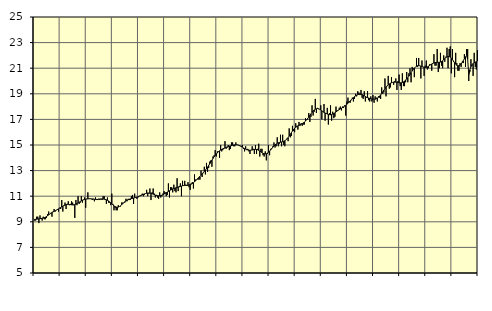
| Category | Finansiell verksamhet, företagstjänster, SNI 64-82 | Series 3 |
|---|---|---|
| nan | 9.1 | 9.19 |
| 87.0 | 9.1 | 9.19 |
| 87.0 | 9.4 | 9.2 |
| 87.0 | 9.4 | 9.22 |
| 87.0 | 8.9 | 9.23 |
| 87.0 | 9.5 | 9.24 |
| 87.0 | 9.3 | 9.26 |
| 87.0 | 9.1 | 9.27 |
| 87.0 | 9.4 | 9.29 |
| 87.0 | 9.2 | 9.32 |
| 87.0 | 9.2 | 9.36 |
| 87.0 | 9.3 | 9.42 |
| nan | 9.6 | 9.48 |
| 88.0 | 9.8 | 9.54 |
| 88.0 | 9.6 | 9.6 |
| 88.0 | 9.7 | 9.66 |
| 88.0 | 9.4 | 9.72 |
| 88.0 | 9.8 | 9.77 |
| 88.0 | 10 | 9.82 |
| 88.0 | 9.8 | 9.86 |
| 88.0 | 9.9 | 9.91 |
| 88.0 | 10 | 9.96 |
| 88.0 | 9.8 | 10.01 |
| 88.0 | 10.1 | 10.06 |
| nan | 10 | 10.11 |
| 89.0 | 10.7 | 10.16 |
| 89.0 | 9.8 | 10.21 |
| 89.0 | 10.3 | 10.26 |
| 89.0 | 10.5 | 10.31 |
| 89.0 | 10 | 10.34 |
| 89.0 | 10.4 | 10.36 |
| 89.0 | 10.6 | 10.36 |
| 89.0 | 10.3 | 10.35 |
| 89.0 | 10.4 | 10.34 |
| 89.0 | 10.6 | 10.33 |
| 89.0 | 10.5 | 10.32 |
| nan | 10.3 | 10.33 |
| 90.0 | 9.3 | 10.35 |
| 90.0 | 10.7 | 10.38 |
| 90.0 | 10.3 | 10.42 |
| 90.0 | 11 | 10.47 |
| 90.0 | 10.4 | 10.52 |
| 90.0 | 10.5 | 10.58 |
| 90.0 | 11 | 10.63 |
| 90.0 | 10.5 | 10.68 |
| 90.0 | 10.7 | 10.72 |
| 90.0 | 10.9 | 10.74 |
| 90.0 | 10.1 | 10.76 |
| nan | 10.8 | 10.78 |
| 91.0 | 11.3 | 10.79 |
| 91.0 | 10.8 | 10.8 |
| 91.0 | 10.8 | 10.8 |
| 91.0 | 10.8 | 10.8 |
| 91.0 | 10.7 | 10.79 |
| 91.0 | 10.8 | 10.77 |
| 91.0 | 10.6 | 10.76 |
| 91.0 | 10.9 | 10.75 |
| 91.0 | 10.7 | 10.75 |
| 91.0 | 10.7 | 10.75 |
| 91.0 | 10.8 | 10.76 |
| nan | 10.7 | 10.78 |
| 92.0 | 10.8 | 10.78 |
| 92.0 | 10.7 | 10.78 |
| 92.0 | 11 | 10.78 |
| 92.0 | 11 | 10.77 |
| 92.0 | 10.7 | 10.75 |
| 92.0 | 10.4 | 10.72 |
| 92.0 | 10.9 | 10.68 |
| 92.0 | 10.5 | 10.63 |
| 92.0 | 10.5 | 10.56 |
| 92.0 | 10.3 | 10.48 |
| 92.0 | 11.2 | 10.4 |
| nan | 10.4 | 10.32 |
| 93.0 | 9.9 | 10.24 |
| 93.0 | 10.1 | 10.19 |
| 93.0 | 9.9 | 10.15 |
| 93.0 | 9.9 | 10.14 |
| 93.0 | 10.3 | 10.15 |
| 93.0 | 10.2 | 10.19 |
| 93.0 | 10.2 | 10.25 |
| 93.0 | 10.5 | 10.33 |
| 93.0 | 10.5 | 10.41 |
| 93.0 | 10.5 | 10.49 |
| 93.0 | 10.5 | 10.57 |
| nan | 10.8 | 10.63 |
| 94.0 | 10.6 | 10.68 |
| 94.0 | 10.8 | 10.72 |
| 94.0 | 10.7 | 10.76 |
| 94.0 | 10.7 | 10.79 |
| 94.0 | 11 | 10.81 |
| 94.0 | 11.1 | 10.83 |
| 94.0 | 10.4 | 10.86 |
| 94.0 | 11.2 | 10.88 |
| 94.0 | 10.9 | 10.9 |
| 94.0 | 10.8 | 10.93 |
| 94.0 | 10.9 | 10.95 |
| nan | 11 | 10.99 |
| 95.0 | 11 | 11.03 |
| 95.0 | 11.1 | 11.07 |
| 95.0 | 11.2 | 11.11 |
| 95.0 | 11 | 11.15 |
| 95.0 | 11.1 | 11.18 |
| 95.0 | 11.2 | 11.21 |
| 95.0 | 11.5 | 11.23 |
| 95.0 | 11 | 11.25 |
| 95.0 | 11.2 | 11.25 |
| 95.0 | 11.6 | 11.24 |
| 95.0 | 10.7 | 11.23 |
| nan | 11.3 | 11.2 |
| 96.0 | 11.6 | 11.16 |
| 96.0 | 11.2 | 11.12 |
| 96.0 | 10.9 | 11.09 |
| 96.0 | 11.1 | 11.06 |
| 96.0 | 10.9 | 11.04 |
| 96.0 | 10.8 | 11.03 |
| 96.0 | 11.3 | 11.04 |
| 96.0 | 10.9 | 11.05 |
| 96.0 | 11 | 11.08 |
| 96.0 | 11.2 | 11.12 |
| 96.0 | 11.4 | 11.17 |
| nan | 11.3 | 11.22 |
| 97.0 | 11 | 11.27 |
| 97.0 | 11.1 | 11.32 |
| 97.0 | 12 | 11.37 |
| 97.0 | 10.9 | 11.42 |
| 97.0 | 11.7 | 11.48 |
| 97.0 | 11.7 | 11.52 |
| 97.0 | 11.3 | 11.57 |
| 97.0 | 11.9 | 11.6 |
| 97.0 | 11.4 | 11.63 |
| 97.0 | 11.3 | 11.66 |
| 97.0 | 12.4 | 11.68 |
| nan | 11.4 | 11.71 |
| 98.0 | 11.8 | 11.73 |
| 98.0 | 12 | 11.76 |
| 98.0 | 11 | 11.79 |
| 98.0 | 12.2 | 11.82 |
| 98.0 | 11.8 | 11.83 |
| 98.0 | 12.2 | 11.84 |
| 98.0 | 11.9 | 11.84 |
| 98.0 | 11.8 | 11.85 |
| 98.0 | 12.1 | 11.86 |
| 98.0 | 11.7 | 11.88 |
| 98.0 | 11.5 | 11.91 |
| nan | 12 | 11.94 |
| 99.0 | 12.1 | 11.99 |
| 99.0 | 11.6 | 12.05 |
| 99.0 | 12.7 | 12.12 |
| 99.0 | 12.3 | 12.21 |
| 99.0 | 12.3 | 12.29 |
| 99.0 | 12.3 | 12.38 |
| 99.0 | 12.3 | 12.47 |
| 99.0 | 12.3 | 12.55 |
| 99.0 | 13 | 12.64 |
| 99.0 | 12.5 | 12.73 |
| 99.0 | 12.8 | 12.83 |
| nan | 13.3 | 12.93 |
| 0.0 | 12.7 | 13.04 |
| 0.0 | 13.6 | 13.15 |
| 0.0 | 12.9 | 13.27 |
| 0.0 | 13.2 | 13.4 |
| 0.0 | 13.7 | 13.53 |
| 0.0 | 13.8 | 13.67 |
| 0.0 | 13.3 | 13.81 |
| 0.0 | 14.1 | 13.95 |
| 0.0 | 14.2 | 14.08 |
| 0.0 | 14.6 | 14.19 |
| 0.0 | 14.1 | 14.3 |
| nan | 14.5 | 14.39 |
| 1.0 | 14.5 | 14.47 |
| 1.0 | 14 | 14.54 |
| 1.0 | 15 | 14.6 |
| 1.0 | 14.5 | 14.65 |
| 1.0 | 14.6 | 14.7 |
| 1.0 | 14.7 | 14.74 |
| 1.0 | 15.3 | 14.78 |
| 1.0 | 14.7 | 14.82 |
| 1.0 | 14.8 | 14.85 |
| 1.0 | 15 | 14.88 |
| 1.0 | 14.6 | 14.91 |
| nan | 14.7 | 14.93 |
| 2.0 | 15.2 | 14.95 |
| 2.0 | 15.2 | 14.98 |
| 2.0 | 14.9 | 15 |
| 2.0 | 14.9 | 15.01 |
| 2.0 | 15.2 | 15.02 |
| 2.0 | 15 | 15.02 |
| 2.0 | 15 | 15 |
| 2.0 | 15 | 14.97 |
| 2.0 | 14.9 | 14.93 |
| 2.0 | 14.9 | 14.88 |
| 2.0 | 15 | 14.83 |
| nan | 14.7 | 14.77 |
| 3.0 | 14.5 | 14.72 |
| 3.0 | 14.9 | 14.68 |
| 3.0 | 14.6 | 14.64 |
| 3.0 | 14.7 | 14.61 |
| 3.0 | 14.5 | 14.59 |
| 3.0 | 14.3 | 14.59 |
| 3.0 | 14.6 | 14.6 |
| 3.0 | 14.9 | 14.61 |
| 3.0 | 14.7 | 14.63 |
| 3.0 | 14.3 | 14.65 |
| 3.0 | 15 | 14.66 |
| nan | 14.3 | 14.65 |
| 4.0 | 14.7 | 14.63 |
| 4.0 | 15.1 | 14.58 |
| 4.0 | 14.1 | 14.53 |
| 4.0 | 14.7 | 14.47 |
| 4.0 | 14.7 | 14.41 |
| 4.0 | 14.2 | 14.35 |
| 4.0 | 14.1 | 14.32 |
| 4.0 | 14.5 | 14.31 |
| 4.0 | 13.8 | 14.32 |
| 4.0 | 14.3 | 14.37 |
| 4.0 | 15 | 14.43 |
| nan | 14.2 | 14.52 |
| 5.0 | 14.7 | 14.62 |
| 5.0 | 14.7 | 14.73 |
| 5.0 | 14.9 | 14.83 |
| 5.0 | 15.2 | 14.93 |
| 5.0 | 14.8 | 15.01 |
| 5.0 | 14.9 | 15.08 |
| 5.0 | 15.6 | 15.14 |
| 5.0 | 14.9 | 15.17 |
| 5.0 | 15.1 | 15.2 |
| 5.0 | 15.8 | 15.22 |
| 5.0 | 14.9 | 15.24 |
| nan | 15.8 | 15.26 |
| 6.0 | 15 | 15.29 |
| 6.0 | 14.9 | 15.33 |
| 6.0 | 15.4 | 15.4 |
| 6.0 | 15.5 | 15.48 |
| 6.0 | 15.3 | 15.58 |
| 6.0 | 16.3 | 15.7 |
| 6.0 | 15.6 | 15.83 |
| 6.0 | 15.7 | 15.96 |
| 6.0 | 16.5 | 16.09 |
| 6.0 | 16.1 | 16.21 |
| 6.0 | 16 | 16.31 |
| nan | 16.7 | 16.38 |
| 7.0 | 16.5 | 16.44 |
| 7.0 | 16.2 | 16.49 |
| 7.0 | 16.8 | 16.54 |
| 7.0 | 16.5 | 16.58 |
| 7.0 | 16.7 | 16.62 |
| 7.0 | 16.5 | 16.67 |
| 7.0 | 16.6 | 16.73 |
| 7.0 | 16.6 | 16.79 |
| 7.0 | 17.1 | 16.87 |
| 7.0 | 17 | 16.97 |
| 7.0 | 17 | 17.07 |
| nan | 17.5 | 17.19 |
| 8.0 | 16.8 | 17.31 |
| 8.0 | 17.2 | 17.43 |
| 8.0 | 18.1 | 17.55 |
| 8.0 | 17.3 | 17.65 |
| 8.0 | 17.6 | 17.74 |
| 8.0 | 18.6 | 17.8 |
| 8.0 | 17.5 | 17.83 |
| 8.0 | 17.9 | 17.85 |
| 8.0 | 17.8 | 17.83 |
| 8.0 | 17.8 | 17.79 |
| 8.0 | 18.1 | 17.74 |
| nan | 17 | 17.67 |
| 9.0 | 17.6 | 17.61 |
| 9.0 | 18.2 | 17.55 |
| 9.0 | 16.9 | 17.5 |
| 9.0 | 17.5 | 17.46 |
| 9.0 | 17.9 | 17.42 |
| 9.0 | 16.6 | 17.39 |
| 9.0 | 17.5 | 17.37 |
| 9.0 | 18.1 | 17.36 |
| 9.0 | 16.9 | 17.38 |
| 9.0 | 17.6 | 17.41 |
| 9.0 | 17.1 | 17.45 |
| nan | 17.2 | 17.51 |
| 10.0 | 18 | 17.58 |
| 10.0 | 17.7 | 17.65 |
| 10.0 | 17.7 | 17.71 |
| 10.0 | 17.9 | 17.76 |
| 10.0 | 18 | 17.82 |
| 10.0 | 17.7 | 17.87 |
| 10.0 | 18 | 17.92 |
| 10.0 | 17.9 | 17.98 |
| 10.0 | 18.1 | 18.04 |
| 10.0 | 17.3 | 18.11 |
| 10.0 | 18.4 | 18.18 |
| nan | 18.7 | 18.26 |
| 11.0 | 18.4 | 18.35 |
| 11.0 | 18.3 | 18.44 |
| 11.0 | 18.5 | 18.53 |
| 11.0 | 18.7 | 18.61 |
| 11.0 | 18.4 | 18.7 |
| 11.0 | 18.6 | 18.78 |
| 11.0 | 19 | 18.84 |
| 11.0 | 18.8 | 18.9 |
| 11.0 | 19.2 | 18.94 |
| 11.0 | 19.1 | 18.97 |
| 11.0 | 18.9 | 18.98 |
| nan | 19.3 | 18.97 |
| 12.0 | 18.7 | 18.94 |
| 12.0 | 18.6 | 18.89 |
| 12.0 | 19.2 | 18.84 |
| 12.0 | 18.4 | 18.79 |
| 12.0 | 18.7 | 18.74 |
| 12.0 | 19.2 | 18.7 |
| 12.0 | 18.5 | 18.67 |
| 12.0 | 18.4 | 18.64 |
| 12.0 | 18.8 | 18.62 |
| 12.0 | 18.4 | 18.6 |
| 12.0 | 18.9 | 18.58 |
| nan | 18.3 | 18.57 |
| 13.0 | 18.8 | 18.58 |
| 13.0 | 18.7 | 18.61 |
| 13.0 | 18.4 | 18.66 |
| 13.0 | 18.8 | 18.72 |
| 13.0 | 18.7 | 18.81 |
| 13.0 | 18.6 | 18.91 |
| 13.0 | 19.5 | 19.03 |
| 13.0 | 19 | 19.15 |
| 13.0 | 19.1 | 19.28 |
| 13.0 | 20.2 | 19.4 |
| 13.0 | 18.8 | 19.52 |
| nan | 19.6 | 19.62 |
| 14.0 | 20.4 | 19.7 |
| 14.0 | 19.4 | 19.77 |
| 14.0 | 19.5 | 19.82 |
| 14.0 | 20.3 | 19.86 |
| 14.0 | 19.9 | 19.89 |
| 14.0 | 19.7 | 19.91 |
| 14.0 | 20 | 19.91 |
| 14.0 | 20.2 | 19.91 |
| 14.0 | 19.3 | 19.9 |
| 14.0 | 20 | 19.88 |
| 14.0 | 20.5 | 19.86 |
| nan | 19.6 | 19.86 |
| 15.0 | 19.3 | 19.86 |
| 15.0 | 20.6 | 19.89 |
| 15.0 | 19.6 | 19.93 |
| 15.0 | 19.6 | 19.99 |
| 15.0 | 19.9 | 20.07 |
| 15.0 | 20.7 | 20.16 |
| 15.0 | 19.9 | 20.26 |
| 15.0 | 20.6 | 20.38 |
| 15.0 | 21 | 20.51 |
| 15.0 | 19.9 | 20.65 |
| 15.0 | 21.1 | 20.78 |
| nan | 21 | 20.91 |
| 16.0 | 20.3 | 21.01 |
| 16.0 | 21.1 | 21.1 |
| 16.0 | 21.8 | 21.15 |
| 16.0 | 21.1 | 21.19 |
| 16.0 | 21.8 | 21.2 |
| 16.0 | 21.2 | 21.19 |
| 16.0 | 20.2 | 21.16 |
| 16.0 | 21.6 | 21.13 |
| 16.0 | 21.1 | 21.09 |
| 16.0 | 20.4 | 21.07 |
| 16.0 | 21.2 | 21.06 |
| nan | 21.6 | 21.07 |
| 17.0 | 20.9 | 21.1 |
| 17.0 | 21 | 21.15 |
| 17.0 | 21.3 | 21.21 |
| 17.0 | 21.3 | 21.27 |
| 17.0 | 20.8 | 21.33 |
| 17.0 | 21.4 | 21.38 |
| 17.0 | 22.1 | 21.41 |
| 17.0 | 21.2 | 21.44 |
| 17.0 | 21.2 | 21.45 |
| 17.0 | 22.5 | 21.46 |
| 17.0 | 20.7 | 21.46 |
| nan | 21 | 21.46 |
| 18.0 | 22.2 | 21.48 |
| 18.0 | 21.2 | 21.52 |
| 18.0 | 21 | 21.58 |
| 18.0 | 22 | 21.66 |
| 18.0 | 21.5 | 21.75 |
| 18.0 | 21.9 | 21.83 |
| 18.0 | 22.6 | 21.89 |
| 18.0 | 21 | 21.92 |
| 18.0 | 22.5 | 21.91 |
| 18.0 | 22.7 | 21.87 |
| 18.0 | 20.6 | 21.78 |
| nan | 22.5 | 21.67 |
| 19.0 | 21.5 | 21.55 |
| 19.0 | 20.3 | 21.42 |
| 19.0 | 22.2 | 21.31 |
| 19.0 | 21.4 | 21.23 |
| 19.0 | 20.8 | 21.19 |
| 19.0 | 20.8 | 21.19 |
| 19.0 | 21.4 | 21.23 |
| 19.0 | 21.1 | 21.32 |
| 19.0 | 21.5 | 21.45 |
| 19.0 | 21.4 | 21.59 |
| 19.0 | 22.1 | 21.74 |
| nan | 21.1 | 21.88 |
| 20.0 | 22.5 | 21.99 |
| 20.0 | 22.5 | 21.7 |
| 20.0 | 20 | 20.48 |
| 20.0 | 20.7 | 20.87 |
| 20.0 | 21.7 | 21.12 |
| 20.0 | 21.2 | 21.27 |
| 20.0 | 20.4 | 21.37 |
| 20.0 | 22.2 | 21.42 |
| 20.0 | 21.1 | 21.47 |
| 20.0 | 20.9 | 21.51 |
| 20.0 | 22.4 | 21.55 |